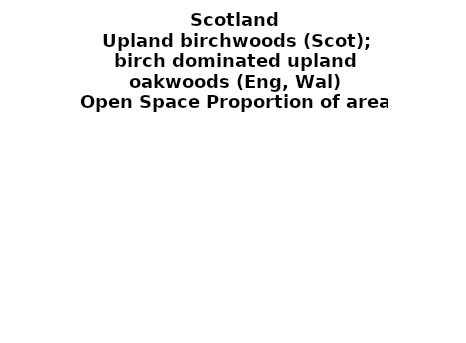
| Category | Upland birchwoods (Scot); birch dominated upland oakwoods (Eng, Wal) |
|---|---|
|  ≥ 10ha, < 10%  | 0.32 |
|   ≥ 10ha, 10-25% | 0.167 |
|   ≥ 10ha, > 25 and <50%  | 0.192 |
|   ≥ 10ha, ≥ 50%  | 0.192 |
|  < 10ha, < 10% | 0.02 |
|  < 10ha, 10-25% | 0.011 |
|  < 10ha, > 25 and < 50% | 0.03 |
|  < 10ha, ≥ 50% | 0.067 |